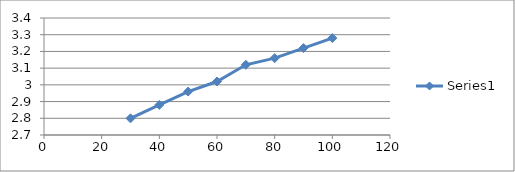
| Category | Series 0 |
|---|---|
| 100.0 | 3.28 |
| 90.0 | 3.22 |
| 80.0 | 3.16 |
| 70.0 | 3.12 |
| 60.0 | 3.02 |
| 50.0 | 2.96 |
| 40.0 | 2.88 |
| 30.0 | 2.8 |